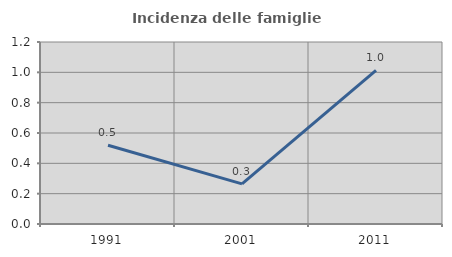
| Category | Incidenza delle famiglie numerose |
|---|---|
| 1991.0 | 0.519 |
| 2001.0 | 0.265 |
| 2011.0 | 1.013 |